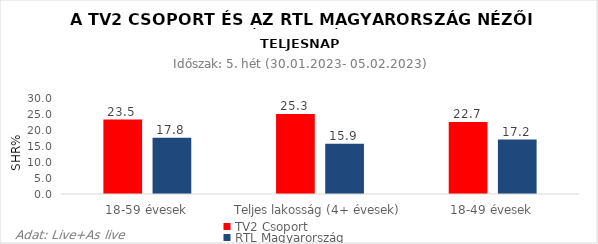
| Category | TV2 Csoport | RTL Magyarország |
|---|---|---|
| 18-59 évesek | 23.5 | 17.8 |
| Teljes lakosság (4+ évesek) | 25.3 | 15.9 |
| 18-49 évesek | 22.7 | 17.2 |